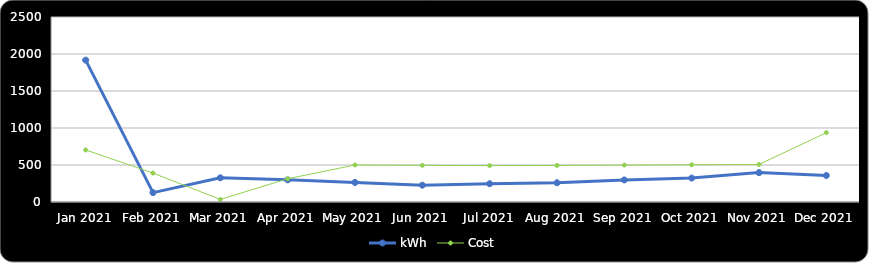
| Category | kWh | Cost |
|---|---|---|
| Jan 2021 | 1917 | 703.19 |
| Feb 2021 | 127 | 391.15 |
| Mar 2021 | 327 | 34.42 |
| Apr 2021 | 299 | 314.32 |
| May 2021 | 264 | 499.9 |
| Jun 2021 | 227 | 495.48 |
| Jul 2021 | 247 | 491.76 |
| Aug 2021 | 260 | 493.9 |
| Sep 2021 | 298 | 498.96 |
| Oct 2021 | 323 | 503.09 |
| Nov 2021 | 397 | 506.86 |
| Dec 2021 | 358 | 936.77 |